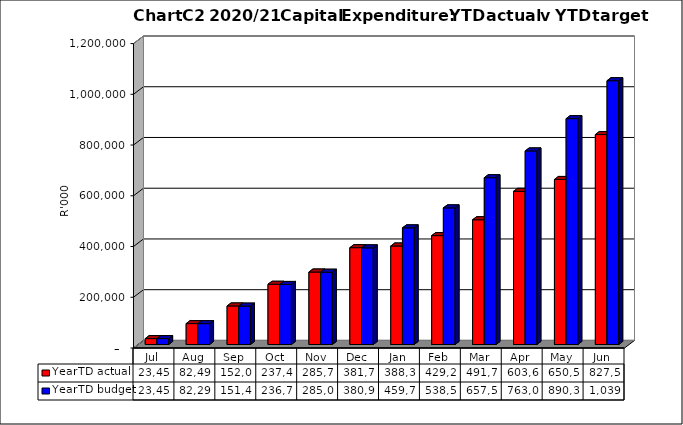
| Category | YearTD actual | YearTD budget |
|---|---|---|
| Jul | 23449713.35 | 23449713.353 |
| Aug | 82492347.842 | 82290541.222 |
| Sep | 152033608.32 | 151417435.557 |
| Oct | 237459289.99 | 236732057.814 |
| Nov | 285752059.8 | 285024827.634 |
| Dec | 381730699.102 | 380978741.757 |
| Jan | 388301468.96 | 459759496.134 |
| Feb | 429270161.99 | 538540239.449 |
| Mar | 491747287.792 | 657535142.431 |
| Apr | 603631812.027 | 763074825.564 |
| May | 650554071.444 | 890305443.132 |
| Jun | 827596867.477 | 1039881030.361 |